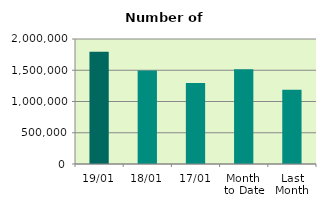
| Category | Series 0 |
|---|---|
| 19/01 | 1794536 |
| 18/01 | 1497888 |
| 17/01 | 1294788 |
| Month 
to Date | 1514086.462 |
| Last
Month | 1187425.652 |